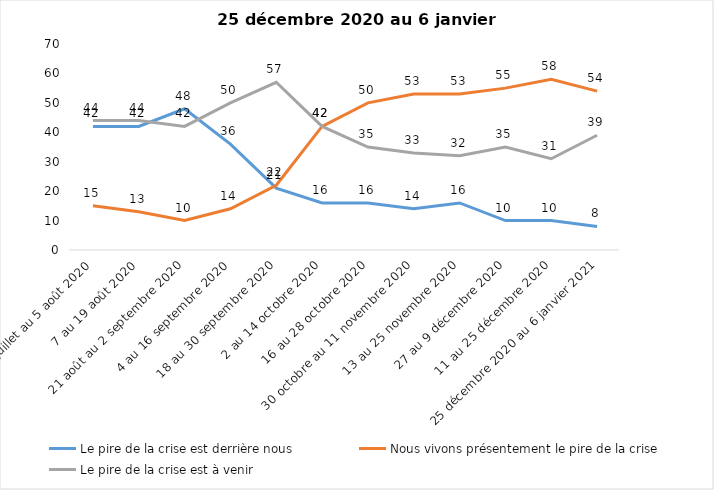
| Category | Le pire de la crise est derrière nous | Nous vivons présentement le pire de la crise | Le pire de la crise est à venir |
|---|---|---|---|
| 24 juillet au 5 août 2020 | 42 | 15 | 44 |
| 7 au 19 août 2020 | 42 | 13 | 44 |
| 21 août au 2 septembre 2020 | 48 | 10 | 42 |
| 4 au 16 septembre 2020 | 36 | 14 | 50 |
| 18 au 30 septembre 2020 | 21 | 22 | 57 |
| 2 au 14 octobre 2020 | 16 | 42 | 42 |
| 16 au 28 octobre 2020 | 16 | 50 | 35 |
| 30 octobre au 11 novembre 2020 | 14 | 53 | 33 |
| 13 au 25 novembre 2020 | 16 | 53 | 32 |
| 27 au 9 décembre 2020 | 10 | 55 | 35 |
| 11 au 25 décembre 2020 | 10 | 58 | 31 |
| 25 décembre 2020 au 6 janvier 2021 | 8 | 54 | 39 |